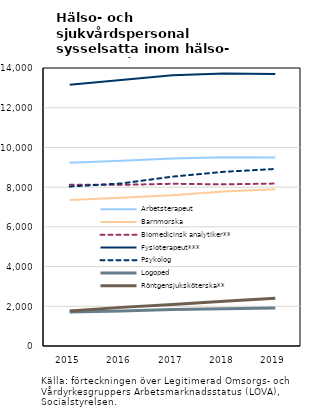
| Category | Arbetsterapeut | Barnmorska | Biomedicinsk analytiker** | Fysioterapeut*** | Psykolog | Logoped | Röntgensjuksköterska** |
|---|---|---|---|---|---|---|---|
| 2015.0 | 9231 | 7349 | 8117 | 13155 | 8032 | 1706 | 1762 |
| 2016.0 | 9326 | 7461 | 8115 | 13391 | 8185 | 1766 | 1945 |
| 2017.0 | 9442 | 7589 | 8169 | 13631 | 8529 | 1833 | 2091 |
| 2018.0 | 9502 | 7782 | 8141 | 13727 | 8772 | 1870 | 2254 |
| 2019.0 | 9492 | 7899 | 8180 | 13696 | 8916 | 1913 | 2406 |